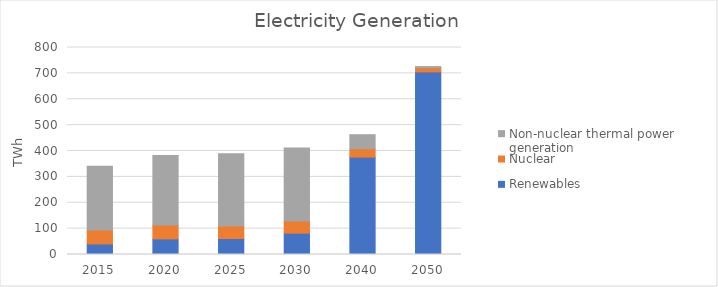
| Category | Renewables | Nuclear | Non-nuclear thermal power generation |
|---|---|---|---|
| 2015.0 | 40.78 | 53.453 | 246.652 |
| 2020.0 | 60.271 | 53.453 | 269.02 |
| 2025.0 | 61.707 | 48.194 | 279.724 |
| 2030.0 | 82.413 | 47.181 | 281.779 |
| 2040.0 | 376.409 | 32.443 | 54.079 |
| 2050.0 | 705.714 | 16.218 | 4.369 |